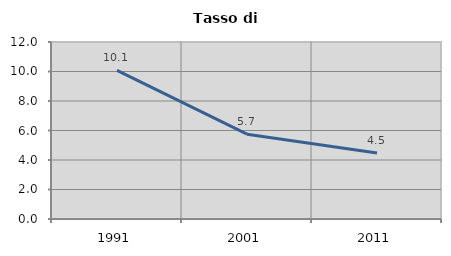
| Category | Tasso di disoccupazione   |
|---|---|
| 1991.0 | 10.077 |
| 2001.0 | 5.748 |
| 2011.0 | 4.481 |